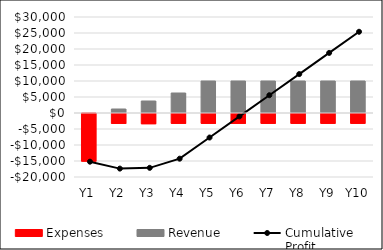
| Category | Expenses | Revenue |
|---|---|---|
| Y1 | -15215 | 0 |
| Y2 | -3410 | 1250 |
| Y3 | -3510 | 3750 |
| Y4 | -3390 | 6250 |
| Y5 | -3390 | 10000 |
| Y6 | -3390 | 10000 |
| Y7 | -3390 | 10000 |
| Y8 | -3390 | 10000 |
| Y9 | -3390 | 10000 |
| Y10 | -3390 | 10000 |